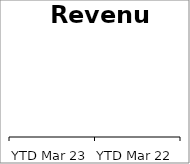
| Category | Revenue |
|---|---|
| YTD Mar 23 | 0 |
| YTD Mar 22 | 0 |